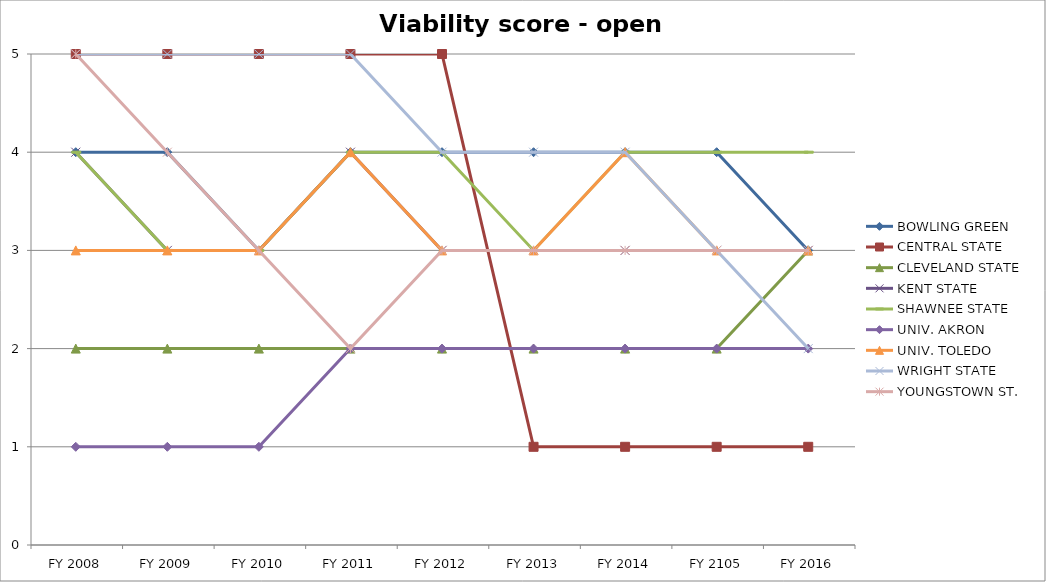
| Category | BOWLING GREEN  | CENTRAL STATE  | CLEVELAND STATE  | KENT STATE  | SHAWNEE STATE  | UNIV. AKRON  | UNIV. TOLEDO  | WRIGHT STATE  | YOUNGSTOWN ST.  |
|---|---|---|---|---|---|---|---|---|---|
| FY 2016 | 3 | 1 | 3 | 3 | 4 | 2 | 3 | 2 | 3 |
| FY 2105 | 4 | 1 | 2 | 3 | 4 | 2 | 3 | 3 | 3 |
| FY 2014 | 4 | 1 | 2 | 3 | 4 | 2 | 4 | 4 | 3 |
| FY 2013 | 4 | 1 | 2 | 3 | 3 | 2 | 3 | 4 | 3 |
| FY 2012 | 4 | 5 | 2 | 3 | 4 | 2 | 3 | 4 | 3 |
| FY 2011 | 4 | 5 | 2 | 4 | 4 | 2 | 4 | 5 | 2 |
| FY 2010 | 3 | 5 | 2 | 3 | 3 | 1 | 3 | 5 | 3 |
| FY 2009 | 4 | 5 | 2 | 3 | 3 | 1 | 3 | 5 | 4 |
| FY 2008 | 4 | 5 | 2 | 4 | 4 | 1 | 3 | 5 | 5 |